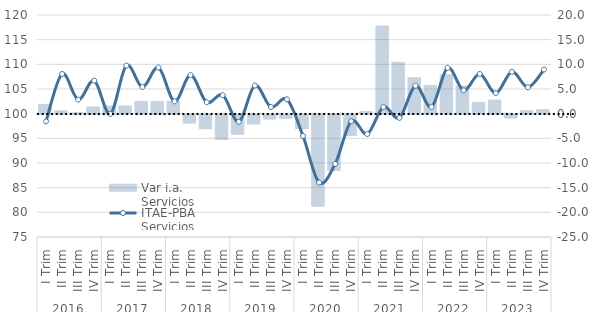
| Category | Var i.a. Servicios |
|---|---|
| 0 | 1.875 |
| 1 | 0.566 |
| 2 | 0.177 |
| 3 | 1.356 |
| 4 | 1.549 |
| 5 | 1.571 |
| 6 | 2.5 |
| 7 | 2.481 |
| 8 | 2.552 |
| 9 | -1.763 |
| 10 | -2.94 |
| 11 | -5.112 |
| 12 | -4.034 |
| 13 | -1.953 |
| 14 | -0.947 |
| 15 | -0.827 |
| 16 | -2.937 |
| 17 | -18.611 |
| 18 | -11.375 |
| 19 | -4.299 |
| 20 | 0.424 |
| 21 | 17.773 |
| 22 | 10.4 |
| 23 | 7.285 |
| 24 | 5.722 |
| 25 | 7.867 |
| 26 | 5.618 |
| 27 | 2.273 |
| 28 | 2.749 |
| 29 | -0.731 |
| 30 | 0.598 |
| 31 | 0.82 |